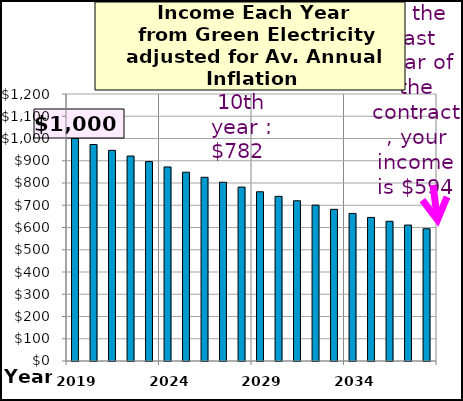
| Category | Income Each Year |
|---|---|
| 2019.0 | 1000 |
| 2020.0 | 973 |
| 2021.0 | 946.729 |
| 2022.0 | 921.167 |
| 2023.0 | 896.296 |
| 2024.0 | 872.096 |
| 2025.0 | 848.549 |
| 2026.0 | 825.638 |
| 2027.0 | 803.346 |
| 2028.0 | 781.656 |
| 2029.0 | 760.551 |
| 2030.0 | 740.016 |
| 2031.0 | 720.036 |
| 2032.0 | 700.595 |
| 2033.0 | 681.679 |
| 2034.0 | 663.273 |
| 2035.0 | 645.365 |
| 2036.0 | 627.94 |
| 2037.0 | 610.986 |
| 2038.0 | 594.489 |